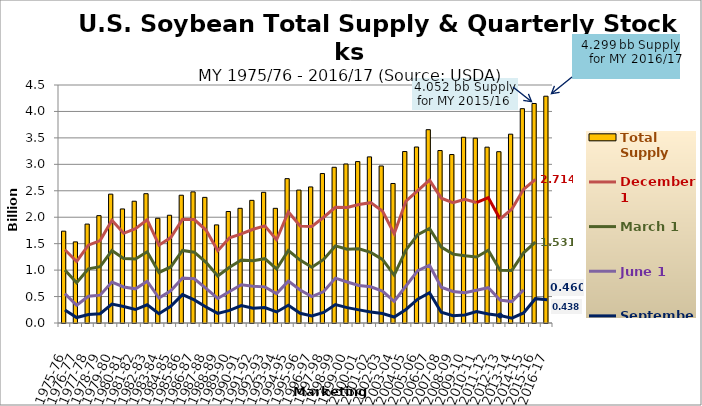
| Category | Total Supply |
|---|---|
| 1975-76 | 1.736 |
| 1976-77 | 1.534 |
| 1977-78 | 1.87 |
| 1978-79 | 2.03 |
| 1979-80 | 2.436 |
| 1980-81 | 2.156 |
| 1981-82 | 2.302 |
| 1982-83 | 2.445 |
| 1983-84 | 1.981 |
| 1984-85 | 2.037 |
| 1985-86 | 2.416 |
| 1986-87 | 2.479 |
| 1987-88 | 2.375 |
| 1988-89 | 1.855 |
| 1989-90 | 2.108 |
| 1990-91 | 2.169 |
| 1991-92 | 2.319 |
| 1992-93 | 2.471 |
| 1993-94 | 2.168 |
| 1994-95 | 2.729 |
| 1995-96 | 2.514 |
| 1996-97 | 2.573 |
| 1997-98 | 2.826 |
| 1998-99 | 2.944 |
| 1999-00 | 3.006 |
| 2000-01 | 3.052 |
| 2001-02 | 3.141 |
| 2002-03 | 2.969 |
| 2003-04 | 2.638 |
| 2004-05 | 3.242 |
| 2005-06 | 3.327 |
| 2006-07 | 3.655 |
| 2007-08 | 3.261 |
| 2008-09 | 3.185 |
| 2009-10 | 3.512 |
| 2010-11 | 3.494 |
| 2011-12 | 3.325 |
| 2012-13 | 3.239 |
| 2013-14 | 3.57 |
| 2014-15 | 4.052 |
| 2015-16 | 4.15 |
| 2016-17 | 4.288 |